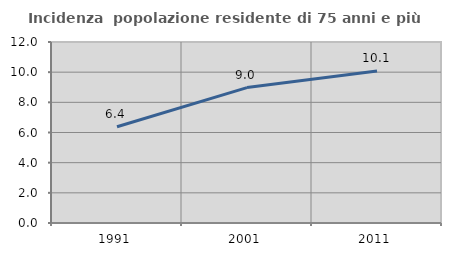
| Category | Incidenza  popolazione residente di 75 anni e più |
|---|---|
| 1991.0 | 6.384 |
| 2001.0 | 8.979 |
| 2011.0 | 10.079 |